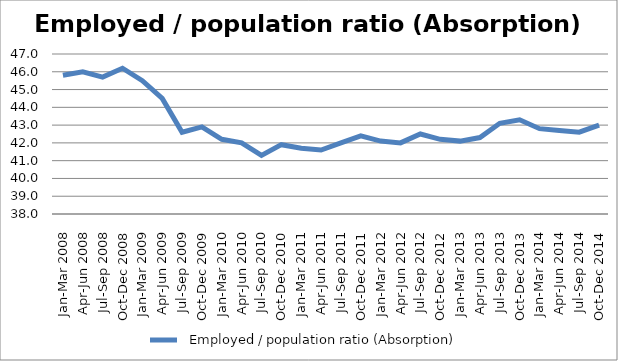
| Category |   Employed / population ratio (Absorption) |
|---|---|
| Jan-Mar 2008 | 45.8 |
| Apr-Jun 2008 | 46 |
| Jul-Sep 2008 | 45.7 |
| Oct-Dec 2008 | 46.2 |
| Jan-Mar 2009 | 45.5 |
| Apr-Jun 2009 | 44.5 |
| Jul-Sep 2009 | 42.6 |
| Oct-Dec 2009 | 42.9 |
| Jan-Mar 2010 | 42.2 |
| Apr-Jun 2010 | 42 |
| Jul-Sep 2010 | 41.3 |
| Oct-Dec 2010 | 41.9 |
| Jan-Mar 2011 | 41.7 |
| Apr-Jun 2011 | 41.6 |
| Jul-Sep 2011 | 42 |
| Oct-Dec 2011 | 42.4 |
| Jan-Mar 2012 | 42.1 |
| Apr-Jun 2012 | 42 |
| Jul-Sep 2012 | 42.5 |
| Oct-Dec 2012 | 42.2 |
| Jan-Mar 2013 | 42.1 |
| Apr-Jun 2013 | 42.3 |
| Jul-Sep 2013 | 43.1 |
| Oct-Dec 2013 | 43.3 |
| Jan-Mar 2014 | 42.8 |
| Apr-Jun 2014 | 42.7 |
| Jul-Sep 2014 | 42.6 |
| Oct-Dec 2014 | 43 |